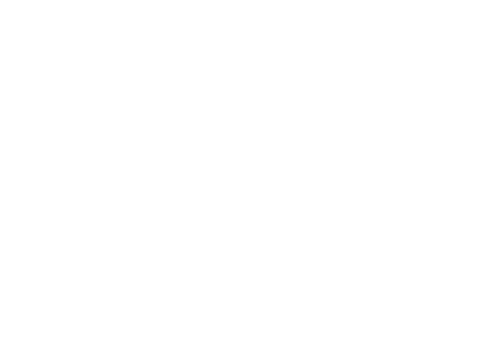
| Category | Series 0 |
|---|---|
| Income | 0 |
| Savings Goal | 0 |
| Expenses | 0 |